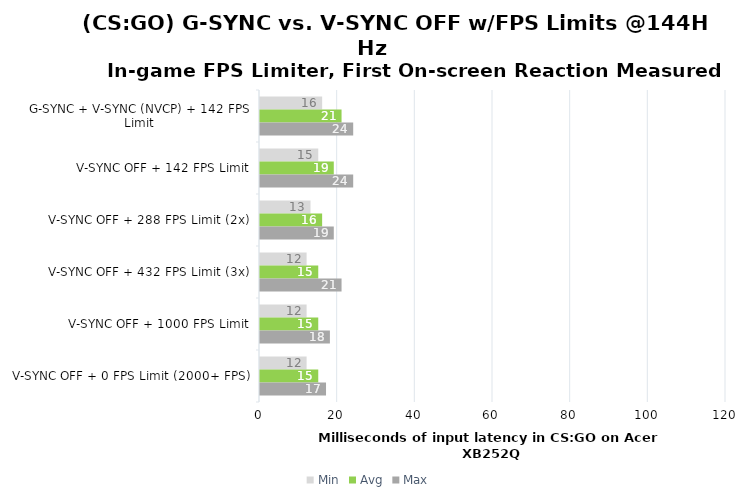
| Category | Min | Avg | Max |
|---|---|---|---|
| G-SYNC + V-SYNC (NVCP) + 142 FPS Limit | 16 | 21 | 24 |
| V-SYNC OFF + 142 FPS Limit | 15 | 19 | 24 |
| V-SYNC OFF + 288 FPS Limit (2x) | 13 | 16 | 19 |
| V-SYNC OFF + 432 FPS Limit (3x) | 12 | 15 | 21 |
| V-SYNC OFF + 1000 FPS Limit | 12 | 15 | 18 |
| V-SYNC OFF + 0 FPS Limit (2000+ FPS) | 12 | 15 | 17 |